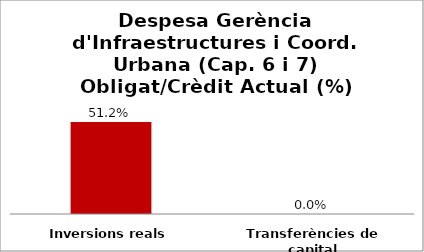
| Category | Series 0 |
|---|---|
| Inversions reals | 0.512 |
| Transferències de capital | 0 |